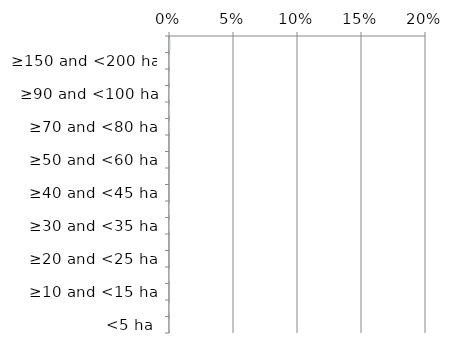
| Category | Not determinable |
|---|---|
| <5 ha | 0 |
| ≥5 and <10 ha | 0 |
| ≥10 and <15 ha | 0 |
| ≥15 and <20 ha | 0 |
| ≥20 and <25 ha | 0 |
| ≥25 and <30 ha | 0 |
| ≥30 and <35 ha | 0 |
| ≥35 and <40 ha | 0 |
| ≥40 and <45 ha | 0 |
| ≥45 and <50 ha | 0 |
| ≥50 and <60 ha | 0 |
| ≥60 and <70 ha | 0 |
| ≥70 and <80 ha | 0 |
| ≥80 and <90 ha | 0 |
| ≥90 and <100 ha | 0 |
| ≥100 and <150 ha | 0 |
| ≥150 and <200 ha | 0 |
| ≥200 ha | 0.001 |